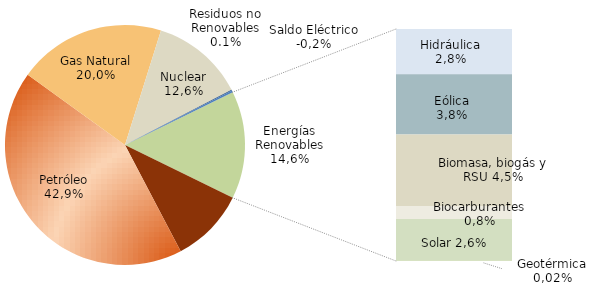
| Category | Series 0 |
|---|---|
| Carbón | 11975.11 |
| Petróleo | 50740.305 |
| Gas Natural | 23663.595 |
| Nuclear | 14932.589 |
| Residuos no Renovables | 119.222 |
| Saldo Eléctrico | -292.916 |
| Hidráulica | 3361.18 |
| Eólica | 4493.269 |
| Biomasa, biogás y RSU | 5327.09 |
| Biocarburantes | 969.238 |
| Solar | 3105.713 |
| Geotérmica | 18.433 |